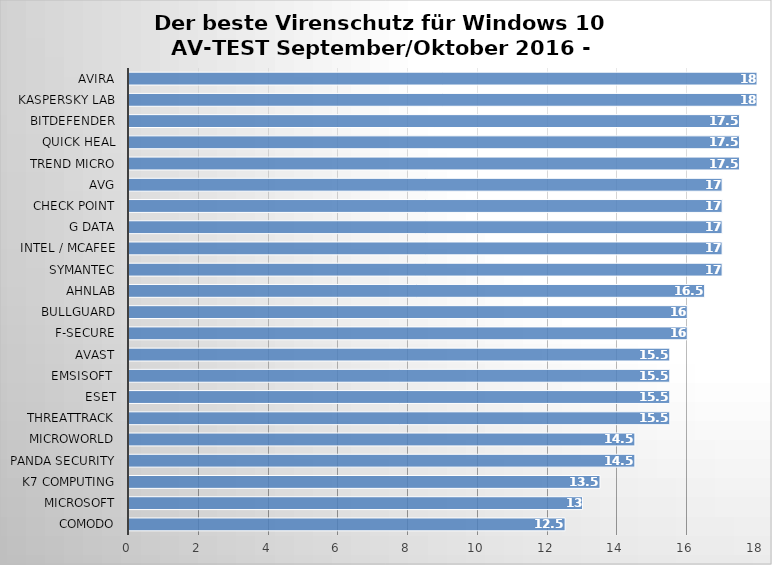
| Category | Series 0 |
|---|---|
| Comodo | 12.5 |
| Microsoft | 13 |
| K7 Computing | 13.5 |
| Panda Security | 14.5 |
| Microworld | 14.5 |
| ThreatTrack | 15.5 |
| ESET | 15.5 |
| Emsisoft  | 15.5 |
| Avast | 15.5 |
| F-Secure | 16 |
| BullGuard | 16 |
| AhnLab | 16.5 |
| Symantec | 17 |
| Intel / McAfee | 17 |
| G Data | 17 |
| Check Point | 17 |
| AVG | 17 |
| Trend Micro | 17.5 |
| Quick Heal | 17.5 |
| Bitdefender | 17.5 |
| Kaspersky Lab | 18 |
| Avira | 18 |